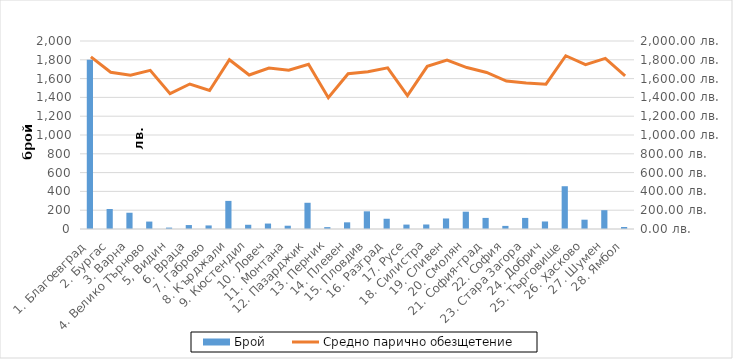
| Category | Брой |
|---|---|
| 1. Благоевград | 1800 |
| 2. Бургас | 213 |
| 3. Варна | 173 |
| 4. Велико Търново | 79 |
| 5, Видин | 15 |
| 6. Враца | 42 |
| 7. Габрово | 38 |
| 8. Кърджали | 299 |
| 9. Кюстендил | 45 |
| 10. Ловеч | 58 |
| 11. Монтана | 35 |
| 12. Пазарджик | 279 |
| 13. Перник | 20 |
| 14. Плевен | 71 |
| 15. Пловдив | 188 |
| 16. Разград | 109 |
| 17. Русе | 47 |
| 18. Силистра | 48 |
| 19. Сливен | 112 |
| 20. Смолян | 184 |
| 21. София-град | 118 |
| 22. София | 33 |
| 23. Стара Загора | 118 |
| 24. Добрич | 80 |
| 25. Търговище | 455 |
| 26. Хасково | 99 |
| 27. Шумен | 200 |
| 28. Ямбол | 21 |